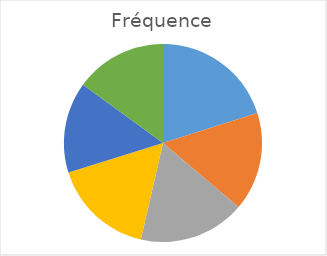
| Category | Fréquence |
|---|---|
| 1.0 | 0.201 |
| 2.0 | 0.161 |
| 3.0 | 0.174 |
| 4.0 | 0.166 |
| 5.0 | 0.148 |
| 6.0 | 0.15 |